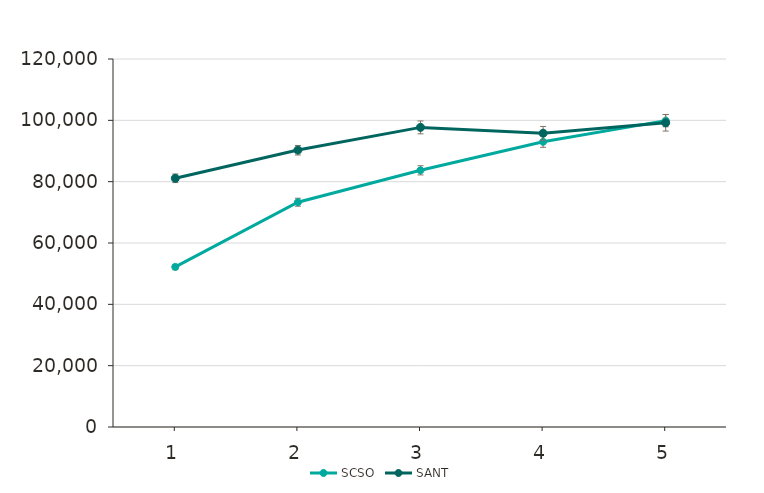
| Category | SCSO | SANT |
|---|---|---|
| 1.0 | 52200 | 81100 |
| 2.0 | 73300 | 90300 |
| 3.0 | 83700 | 97700 |
| 4.0 | 93000 | 95800 |
| 5.0 | 99900 | 99200 |